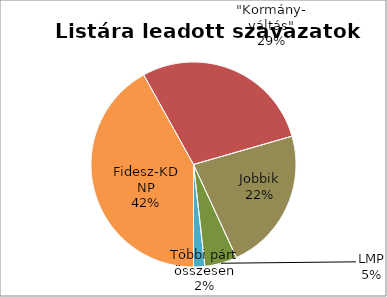
| Category | Listás szavazatok |
|---|---|
| Fidesz-KDNP | 2180669 |
| "Kormány-
váltás" | 1488284 |
| Jobbik | 1174551 |
| LMP | 265120 |
| Többi párt összesen | 92290 |